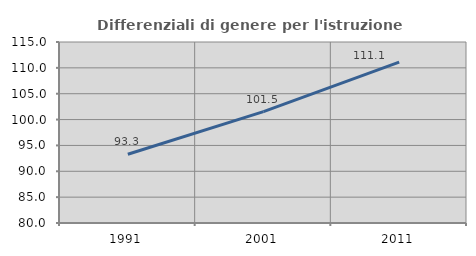
| Category | Differenziali di genere per l'istruzione superiore |
|---|---|
| 1991.0 | 93.29 |
| 2001.0 | 101.55 |
| 2011.0 | 111.095 |